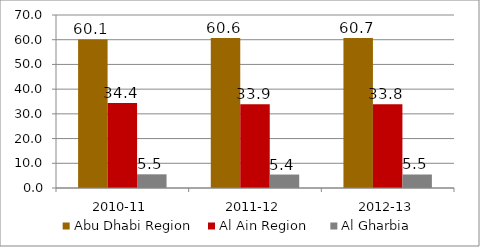
| Category | Abu Dhabi Region  | Al Ain Region    | Al Gharbia |
|---|---|---|---|
| 2010-11 | 60.087 | 34.375 | 5.538 |
| 2011-12 | 60.649 | 33.906 | 5.445 |
| 2012-13 | 60.687 | 33.849 | 5.464 |